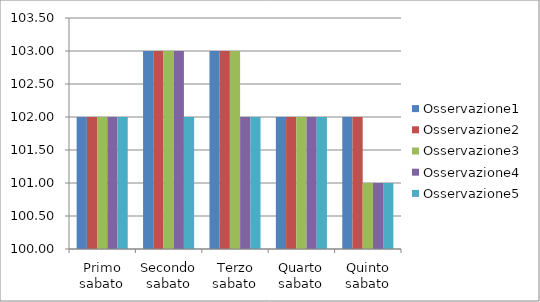
| Category | Osservazione1 | Osservazione2 | Osservazione3 | Osservazione4 | Osservazione5 |
|---|---|---|---|---|---|
| Primo sabato | 102 | 102 | 102 | 102 | 102 |
| Secondo sabato | 103 | 103 | 103 | 103 | 102 |
| Terzo sabato | 103 | 103 | 103 | 102 | 102 |
| Quarto sabato | 102 | 102 | 102 | 102 | 102 |
| Quinto sabato | 102 | 102 | 101 | 101 | 101 |